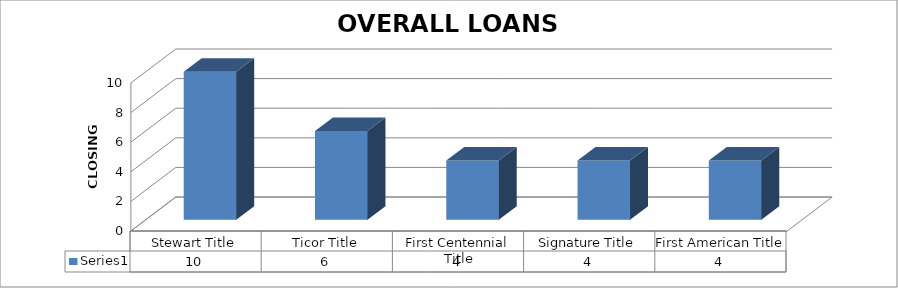
| Category | Series 0 |
|---|---|
| Stewart Title | 10 |
| Ticor Title | 6 |
| First Centennial Title | 4 |
| Signature Title | 4 |
| First American Title | 4 |